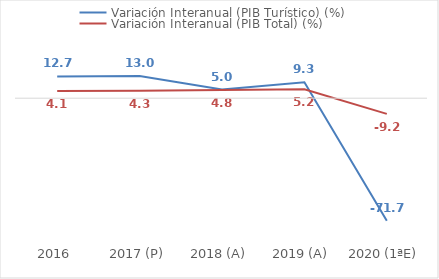
| Category | Variación Interanual (PIB Turístico) (%) | Variación Interanual (PIB Total) (%) |
|---|---|---|
| 2016 | 12.698 | 4.142 |
| 2017 (P) | 12.998 | 4.289 |
| 2018 (A) | 5.046 | 4.812 |
| 2019 (A) | 9.308 | 5.165 |
| 2020 (1ªE) | -71.704 | -9.172 |